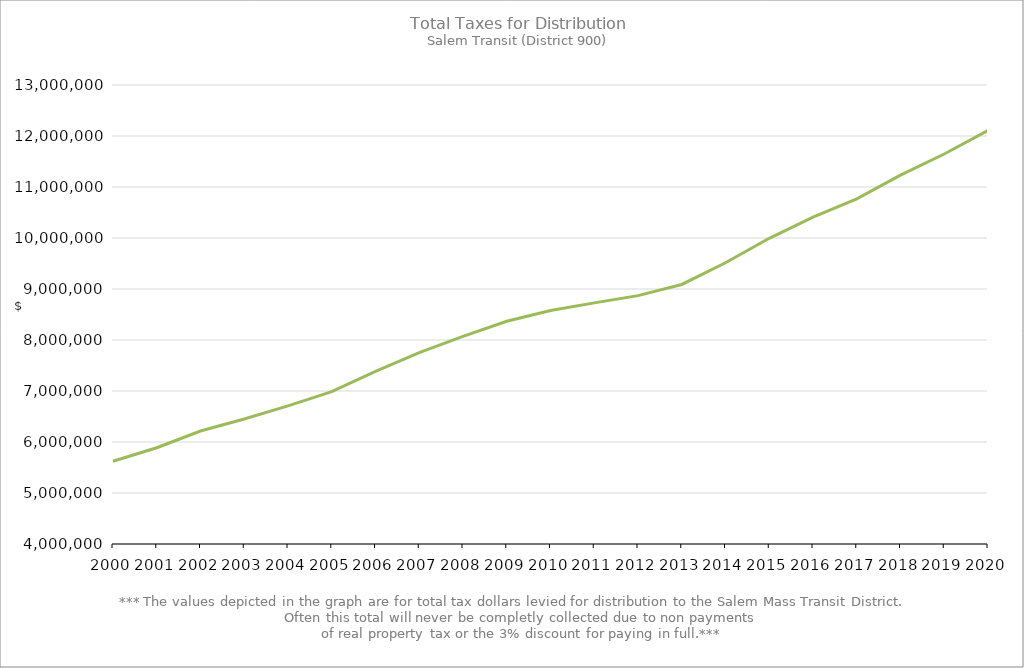
| Category | Series 0 |
|---|---|
| 2000.0 | 5622012.06 |
| 2001.0 | 5887184.42 |
| 2002.0 | 6216092.53 |
| 2003.0 | 6451647.07 |
| 2004.0 | 6709450.21 |
| 2005.0 | 6985824.79 |
| 2006.0 | 7384355.07 |
| 2007.0 | 7754366.9 |
| 2008.0 | 8070852.17 |
| 2009.0 | 8367236.75 |
| 2010.0 | 8578531.46 |
| 2011.0 | 8727737.16 |
| 2012.0 | 8869641.14 |
| 2013.0 | 9088941.33 |
| 2014.0 | 9515313.87 |
| 2015.0 | 9994431.05 |
| 2016.0 | 10410378.92 |
| 2017.0 | 10765916.4 |
| 2018.0 | 11231577.6 |
| 2019.0 | 11647536.34 |
| 2020.0 | 12109545.52 |